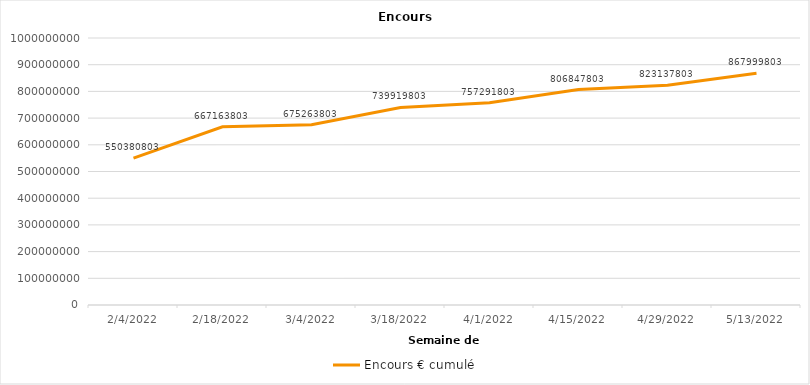
| Category | Encours € cumulé |
|---|---|
| 2/4/22 | 550380803 |
| 2/18/22 | 667163803 |
| 3/4/22 | 675263803 |
| 3/18/22 | 739919803 |
| 4/1/22 | 757291803 |
| 4/15/22 | 806847803 |
| 4/29/22 | 823137803 |
| 5/13/22 | 867999803 |